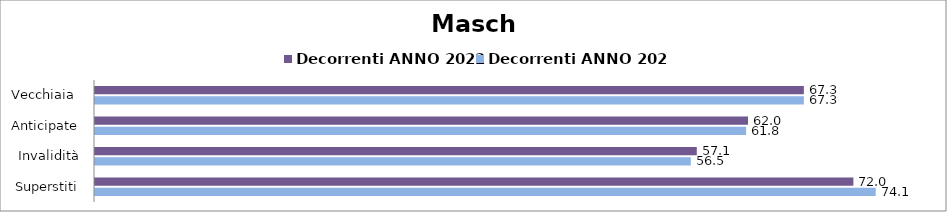
| Category | Decorrenti ANNO 2022 | Decorrenti ANNO 2023 |
|---|---|---|
| Vecchiaia  | 67.27 | 67.27 |
| Anticipate | 61.97 | 61.79 |
| Invalidità | 57.11 | 56.54 |
| Superstiti | 71.97 | 74.09 |